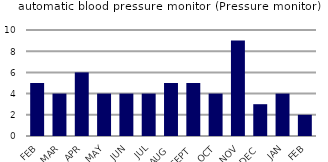
| Category | automatic blood pressure monitor (Pressure monitor) |
|---|---|
| FEB | 5 |
| MAR | 4 |
| APR | 6 |
| MAY | 4 |
| JUN | 4 |
| JUL | 4 |
| AUG | 5 |
| SEPT | 5 |
| OCT | 4 |
| NOV | 9 |
| DEC | 3 |
| JAN | 4 |
| FEB | 2 |